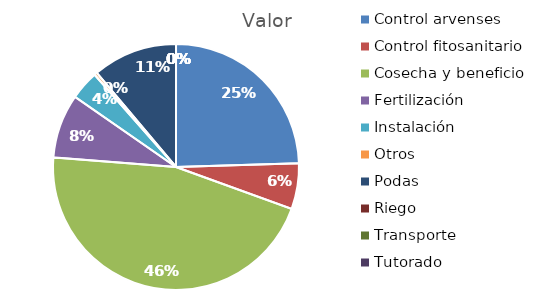
| Category | Valor |
|---|---|
| Control arvenses | 10866558 |
| Control fitosanitario | 2666640 |
| Cosecha y beneficio | 20266464 |
| Fertilización | 3733296 |
| Instalación | 1699983 |
| Otros | 166665 |
| Podas | 4933284 |
| Riego | 0 |
| Transporte | 0 |
| Tutorado | 0 |